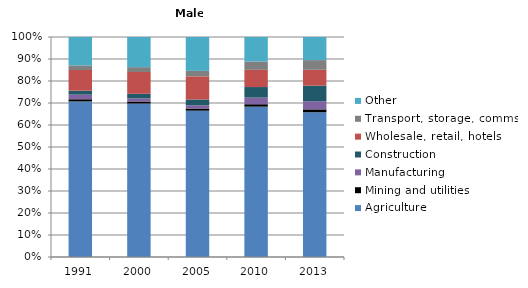
| Category | Agriculture | Mining and utilities | Manufacturing | Construction | Wholesale, retail, hotels | Transport, storage, comms | Other |
|---|---|---|---|---|---|---|---|
| 1991.0 | 70.7 | 1 | 2.1 | 1.8 | 9.4 | 2.1 | 12.9 |
| 2000.0 | 69.7 | 0.9 | 1.4 | 2.1 | 9.9 | 2.2 | 13.7 |
| 2005.0 | 66.5 | 1 | 1.5 | 2.6 | 10.5 | 2.5 | 15.4 |
| 2010.0 | 68.2 | 1.1 | 3 | 4.8 | 7.8 | 3.8 | 11.1 |
| 2013.0 | 65.8 | 1.3 | 3.7 | 7.1 | 7.2 | 4.4 | 10.5 |